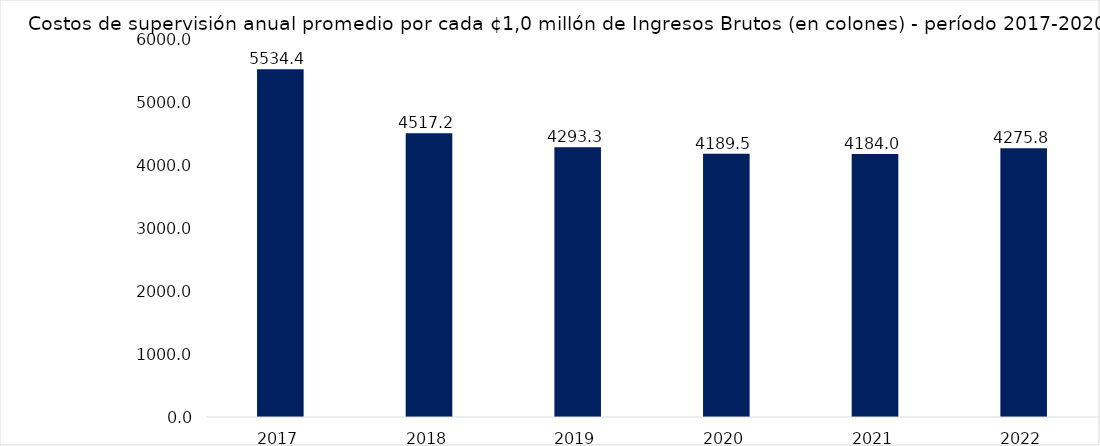
| Category | Costos de supervisión anual promedio por cada ¢1,0 millón de Ingresos Brutos (en colones) |
|---|---|
| 2017.0 | 5534.421 |
| 2018.0 | 4517.229 |
| 2019.0 | 4293.322 |
| 2020.0 | 4189.538 |
| 2021.0 | 4183.996 |
| 2022.0 | 4275.836 |